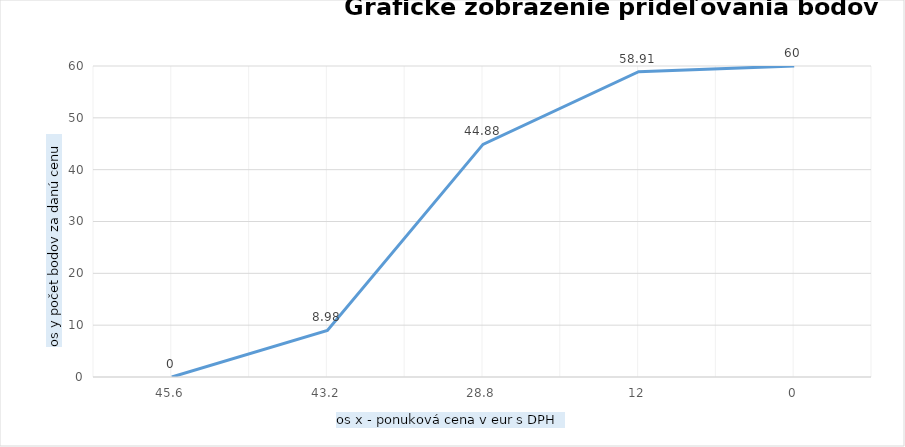
| Category | Series 0 |
|---|---|
| 45.6 | 0 |
| 43.2 | 8.98 |
| 28.8 | 44.88 |
| 12.0 | 58.91 |
| 0.0 | 60 |